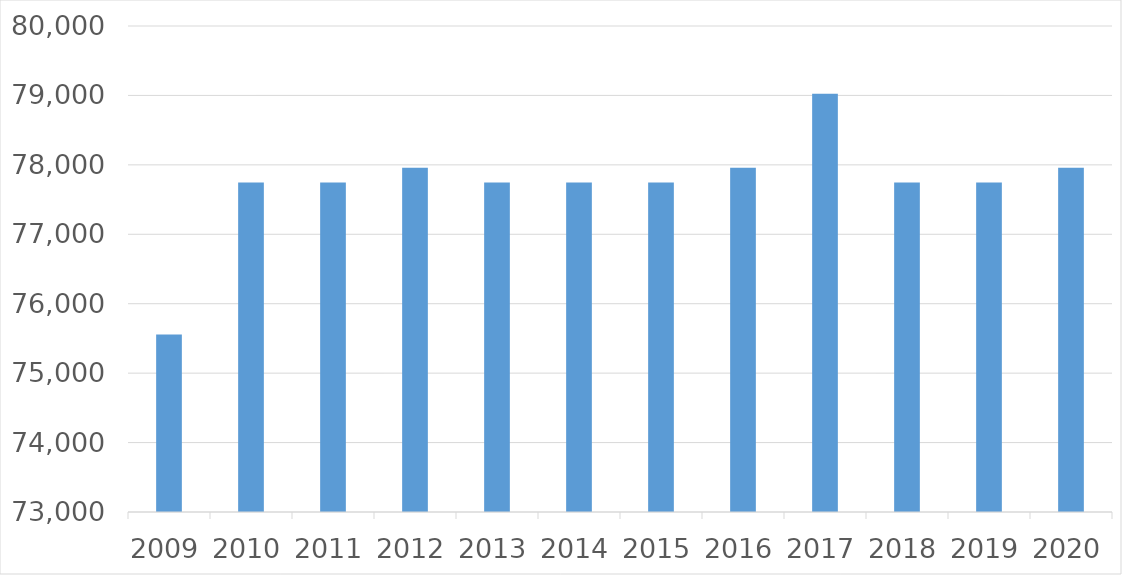
| Category | Series 0 |
|---|---|
| 2009 | 75555 |
| 2010 | 77745 |
| 2011 | 77745 |
| 2012 | 77958 |
| 2013 | 77745 |
| 2014 | 77745 |
| 2015 | 77745 |
| 2016 | 77958 |
| 2017 | 79023 |
| 2018 | 77745 |
| 2019 | 77745 |
| 2020 | 77958 |